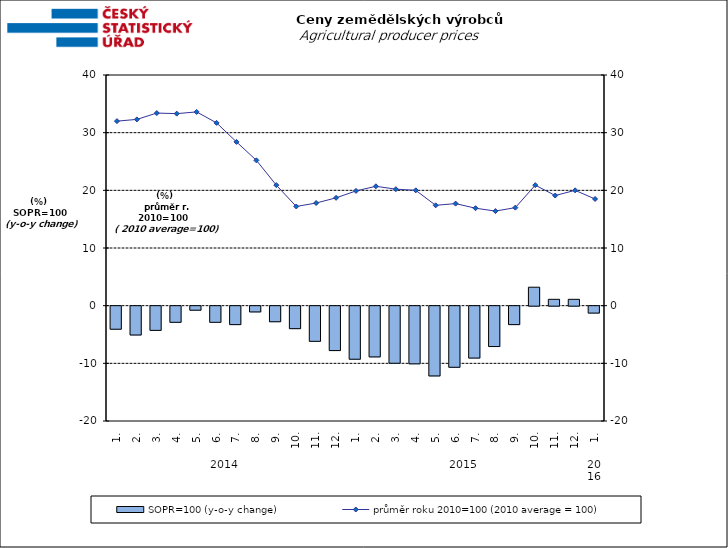
| Category | SOPR=100 (y-o-y change)   |
|---|---|
| 0 | -4 |
| 1 | -5 |
| 2 | -4.2 |
| 3 | -2.8 |
| 4 | -0.7 |
| 5 | -2.8 |
| 6 | -3.2 |
| 7 | -1 |
| 8 | -2.7 |
| 9 | -3.9 |
| 10 | -6.1 |
| 11 | -7.7 |
| 12 | -9.2 |
| 13 | -8.8 |
| 14 | -9.9 |
| 15 | -10 |
| 16 | -12.1 |
| 17 | -10.6 |
| 18 | -9 |
| 19 | -7 |
| 20 | -3.2 |
| 21 | 3.2 |
| 22 | 1.1 |
| 23 | 1.1 |
| 24 | -1.2 |